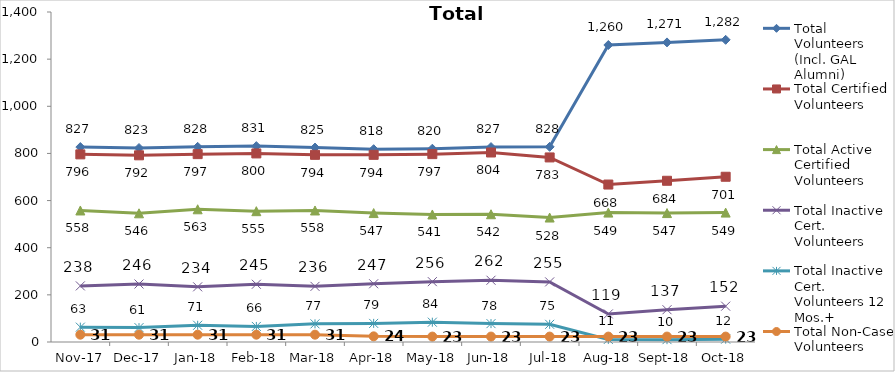
| Category | Total Volunteers (Incl. GAL Alumni) | Total Certified Volunteers | Total Active Certified Volunteers | Total Inactive Cert. Volunteers | Total Inactive Cert. Volunteers 12 Mos.+ | Total Non-Case Volunteers |
|---|---|---|---|---|---|---|
| 2017-11-01 | 827 | 796 | 558 | 238 | 63 | 31 |
| 2017-12-01 | 823 | 792 | 546 | 246 | 61 | 31 |
| 2018-01-01 | 828 | 797 | 563 | 234 | 71 | 31 |
| 2018-02-01 | 831 | 800 | 555 | 245 | 66 | 31 |
| 2018-03-01 | 825 | 794 | 558 | 236 | 77 | 31 |
| 2018-04-01 | 818 | 794 | 547 | 247 | 79 | 24 |
| 2018-05-01 | 820 | 797 | 541 | 256 | 84 | 23 |
| 2018-06-01 | 827 | 804 | 542 | 262 | 78 | 23 |
| 2018-07-01 | 828 | 783 | 528 | 255 | 75 | 23 |
| 2018-08-01 | 1260 | 668 | 549 | 119 | 11 | 23 |
| 2018-09-01 | 1271 | 684 | 547 | 137 | 10 | 23 |
| 2018-10-01 | 1282 | 701 | 549 | 152 | 12 | 23 |